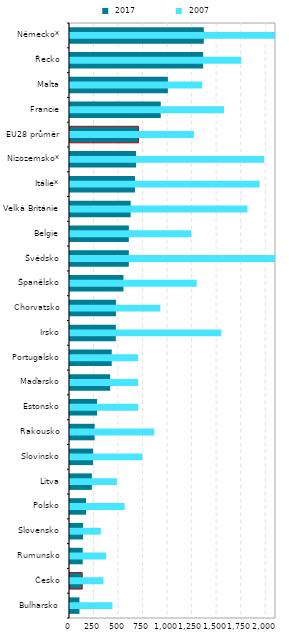
| Category |  2017 |
|---|---|
| Bulharsko | 96.587 |
| Česko | 124.443 |
| Rumunsko | 129.832 |
| Slovensko | 133.233 |
| Polsko | 163.024 |
| Litva | 223.353 |
| Slovinsko | 234.892 |
| Rakousko | 251.022 |
| Estonsko | 275.73 |
| Maďarsko | 409.341 |
| Portugalsko | 425.35 |
| Irsko | 467.167 |
| Chorvatsko | 468.3 |
| Španělsko | 545.105 |
| Švédsko | 599.761 |
| Belgie | 599.854 |
| Velká Británie | 618.658 |
| Itálie* | 662.325 |
| Nizozemsko* | 673.832 |
| EU28 průměr | 698.55 |
| Francie | 925.153 |
| Malta | 997.92 |
| Řecko | 1357.404 |
| Německo* | 1363.954 |